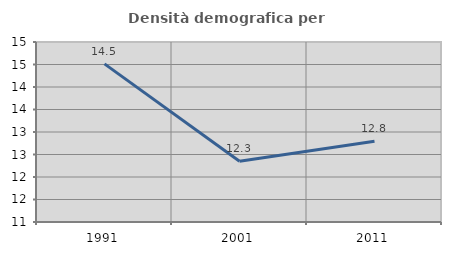
| Category | Densità demografica |
|---|---|
| 1991.0 | 14.514 |
| 2001.0 | 12.35 |
| 2011.0 | 12.795 |